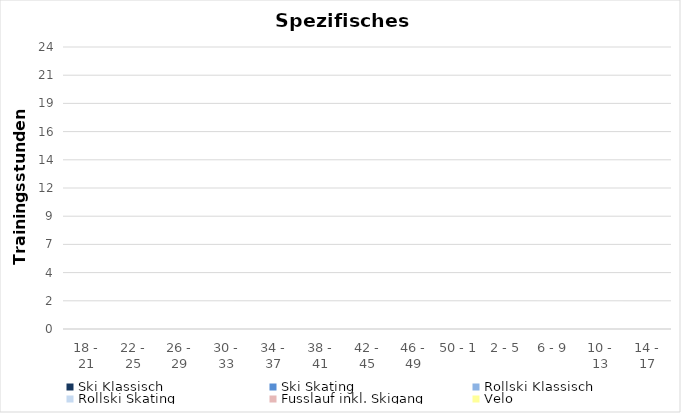
| Category | Ski Klassisch | Ski Skating | Rollski Klassisch | Rollski Skating | Fusslauf inkl. Skigang | Velo |
|---|---|---|---|---|---|---|
| 18 - 21 | 0 | 0 | 0 | 0 | 0 | 0 |
| 22 - 25 | 0 | 0 | 0 | 0 | 0 | 0 |
| 26 - 29 | 0 | 0 | 0 | 0 | 0 | 0 |
| 30 - 33 | 0 | 0 | 0 | 0 | 0 | 0 |
| 34 - 37 | 0 | 0 | 0 | 0 | 0 | 0 |
| 38 - 41 | 0 | 0 | 0 | 0 | 0 | 0 |
| 42 - 45 | 0 | 0 | 0 | 0 | 0 | 0 |
| 46 - 49 | 0 | 0 | 0 | 0 | 0 | 0 |
| 50 - 1 | 0 | 0 | 0 | 0 | 0 | 0 |
| 2 - 5 | 0 | 0 | 0 | 0 | 0 | 0 |
| 6 - 9 | 0 | 0 | 0 | 0 | 0 | 0 |
| 10 - 13 | 0 | 0 | 0 | 0 | 0 | 0 |
| 14 - 17 | 0 | 0 | 0 | 0 | 0 | 0 |